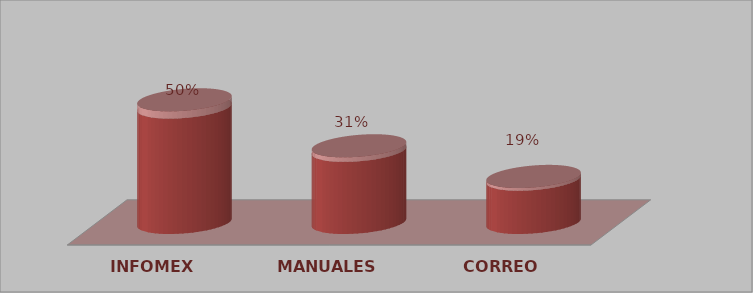
| Category | Series 0 | Series 1 |
|---|---|---|
| INFOMEX | 8 | 0.5 |
| MANUALES | 5 | 0.312 |
| CORREO | 3 | 0.188 |